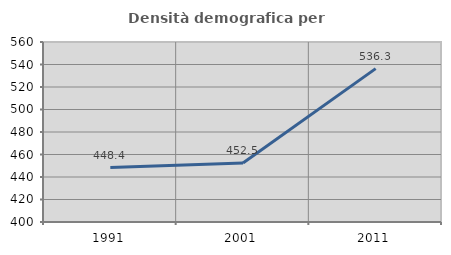
| Category | Densità demografica |
|---|---|
| 1991.0 | 448.438 |
| 2001.0 | 452.516 |
| 2011.0 | 536.325 |